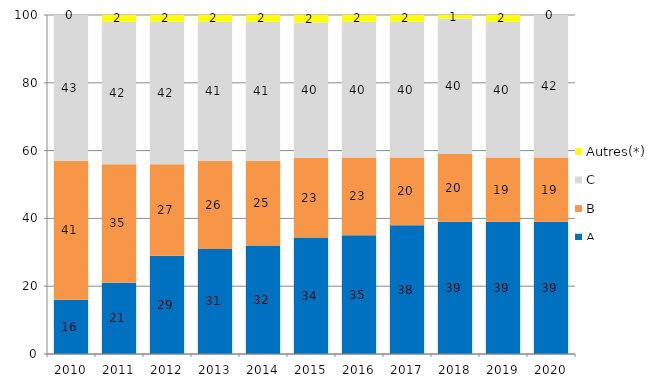
| Category | A | B | C | Autres(*) |
|---|---|---|---|---|
| 2010.0 | 16 | 41 | 43 | 0 |
| 2011.0 | 21 | 35 | 42 | 2 |
| 2012.0 | 29 | 27 | 42 | 2 |
| 2013.0 | 31 | 26 | 41 | 2 |
| 2014.0 | 32 | 25 | 41 | 2 |
| 2015.0 | 34.4 | 23.4 | 40 | 2.2 |
| 2016.0 | 35 | 23 | 40 | 2 |
| 2017.0 | 38 | 20 | 40 | 2 |
| 2018.0 | 39 | 20 | 40 | 1 |
| 2019.0 | 39 | 19 | 40 | 2 |
| 2020.0 | 39 | 19 | 42 | 0 |